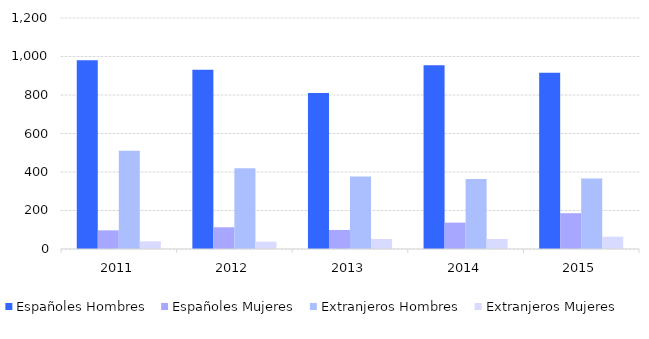
| Category | Españoles Hombres | Españoles Mujeres | Extranjeros Hombres | Extranjeros Mujeres |
|---|---|---|---|---|
| 2011.0 | 980 | 97 | 511 | 40 |
| 2012.0 | 931 | 113 | 419 | 38 |
| 2013.0 | 811 | 99 | 376 | 52 |
| 2014.0 | 955 | 137 | 364 | 52 |
| 2015.0 | 916 | 186 | 366 | 64 |